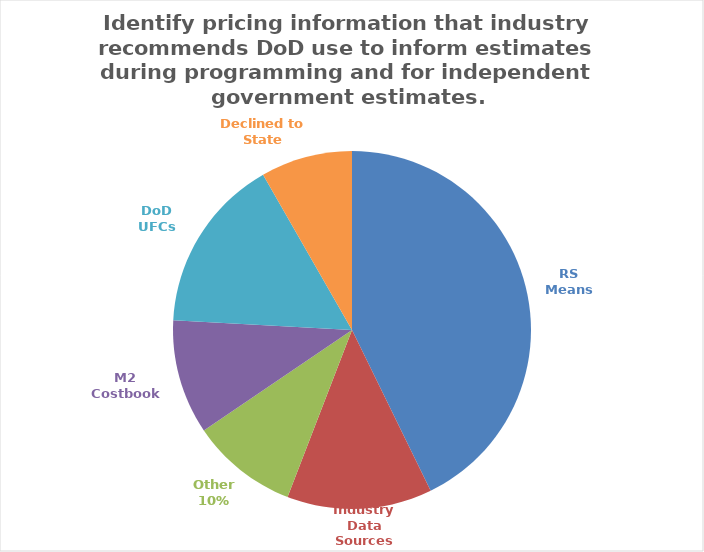
| Category | Series 0 |
|---|---|
| RS Means | 0.428 |
| Industry Data Sources | 0.131 |
| Other | 0.097 |
| M2 Costbook | 0.103 |
| DoD UFCs | 0.159 |
| Declined to State | 0.083 |